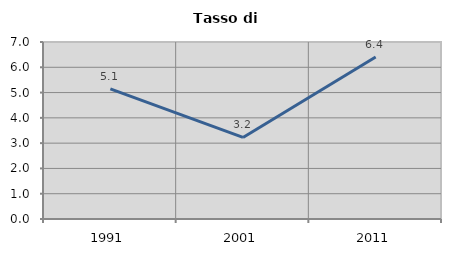
| Category | Tasso di disoccupazione   |
|---|---|
| 1991.0 | 5.147 |
| 2001.0 | 3.226 |
| 2011.0 | 6.41 |